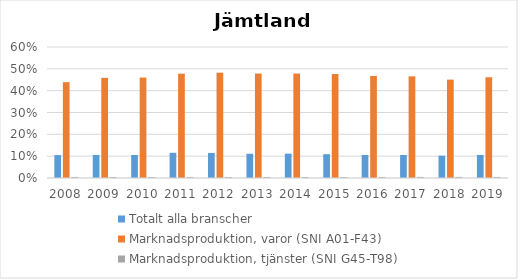
| Category | Totalt alla branscher | Marknadsproduktion, varor (SNI A01-F43) | Marknadsproduktion, tjänster (SNI G45-T98) |
|---|---|---|---|
| 2008.0 | 0.105 | 0.439 | 0.005 |
| 2009.0 | 0.106 | 0.459 | 0.005 |
| 2010.0 | 0.105 | 0.46 | 0.005 |
| 2011.0 | 0.115 | 0.478 | 0.004 |
| 2012.0 | 0.115 | 0.482 | 0.004 |
| 2013.0 | 0.111 | 0.479 | 0.005 |
| 2014.0 | 0.112 | 0.478 | 0.005 |
| 2015.0 | 0.109 | 0.476 | 0.005 |
| 2016.0 | 0.105 | 0.467 | 0.005 |
| 2017.0 | 0.105 | 0.466 | 0.005 |
| 2018.0 | 0.102 | 0.451 | 0.005 |
| 2019.0 | 0.106 | 0.462 | 0.005 |